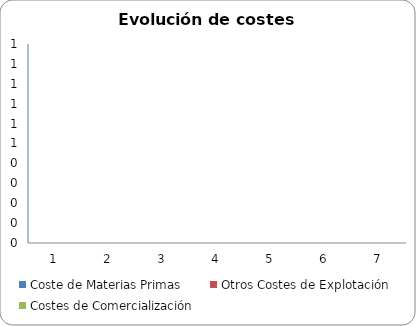
| Category | Coste de Materias Primas | Otros Costes de Explotación | Costes de Comercialización |
|---|---|---|---|
| 0 | 0 | 0 | 0 |
| 1 | 0 | 0 | 0 |
| 2 | 0 | 0 | 0 |
| 3 | 0 | 0 | 0 |
| 4 | 0 | 0 | 0 |
| 5 | 0 | 0 | 0 |
| 6 | 0 | 0 | 0 |